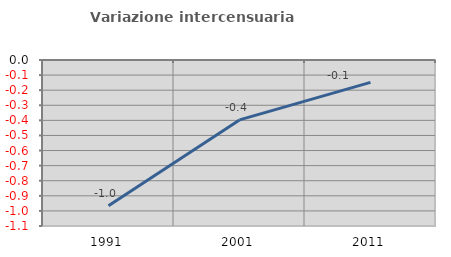
| Category | Variazione intercensuaria annua |
|---|---|
| 1991.0 | -0.966 |
| 2001.0 | -0.397 |
| 2011.0 | -0.149 |